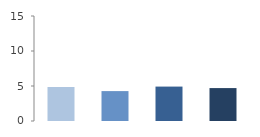
| Category | Rate (%) |
|---|---|
| 2009.0 | 4.861 |
| 2010.0 | 4.272 |
| 2011.0 | 4.917 |
| 2012.0 | 4.703 |